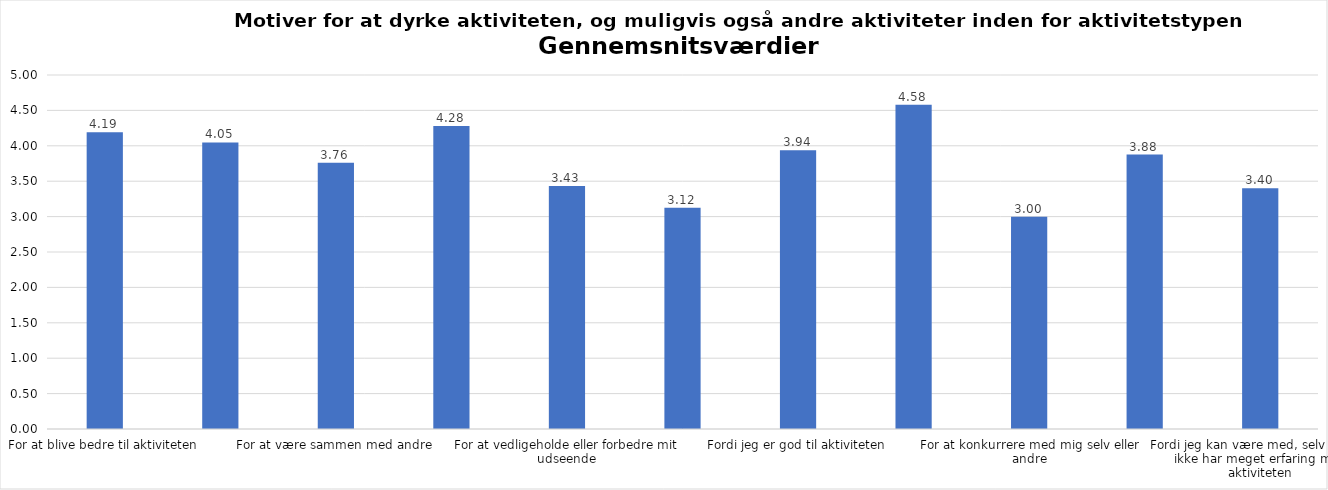
| Category | Gennemsnit |
|---|---|
| For at blive bedre til aktiviteten | 4.191 |
| For at vedligeholde eller forbedre min sundhed (fx helbred, fysisk form) | 4.048 |
| For at være sammen med andre | 3.762 |
| For at gøre noget godt for mig selv | 4.281 |
| For at vedligeholde eller forbedre mit udseende | 3.433 |
| Fordi andre i min omgangskreds opmuntrer mig til det | 3.124 |
| Fordi jeg er god til aktiviteten | 3.939 |
| Fordi jeg godt kan lide aktiviteten | 4.58 |
| For at konkurrere med mig selv eller andre | 2.997 |
| Fordi aktiviteten passer godt ind i min hverdag | 3.877 |
| Fordi jeg kan være med, selv om jeg ikke har meget erfaring med aktiviteten | 3.402 |